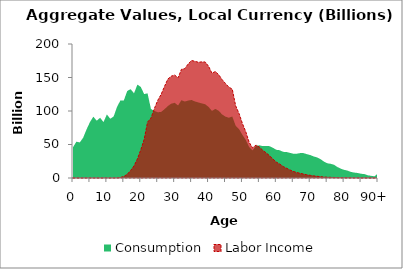
| Category | Consumption | Labor Income |
|---|---|---|
| 0 | 45936.427 | 0 |
|  | 54255.229 | 0 |
| 2 | 53065.486 | 0 |
| 3 | 60148.723 | 0 |
| 4 | 72591.052 | 0 |
| 5 | 83432.402 | 0 |
| 6 | 91546.477 | 0 |
| 7 | 85471.58 | 0 |
| 8 | 89942.673 | 0 |
| 9 | 83484.271 | 0 |
| 10 | 94815.383 | 0 |
| 11 | 88360.903 | 1.152 |
| 12 | 91930.239 | 29.5 |
| 13 | 106209.657 | 161.419 |
| 14 | 115863.689 | 769.564 |
| 15 | 115803.793 | 2270.729 |
| 16 | 129835.652 | 5556.189 |
| 17 | 132615.077 | 11134.875 |
| 18 | 126402.208 | 18033.81 |
| 19 | 139369.152 | 28402.507 |
| 20 | 135966.545 | 42038.818 |
| 21 | 125264.389 | 57671.408 |
| 22 | 126366.951 | 83533.535 |
| 23 | 103033.426 | 89332.149 |
| 24 | 100197.038 | 103474.667 |
| 25 | 98112.445 | 115806.153 |
| 26 | 98632.367 | 124751.923 |
| 27 | 102690.591 | 136626.567 |
| 28 | 107488.016 | 147753.256 |
| 29 | 110945.722 | 151971.844 |
| 30 | 112235.863 | 153651.645 |
| 31 | 108263.576 | 149386.562 |
| 32 | 116128.157 | 162242.102 |
| 33 | 114139.009 | 163270.689 |
| 34 | 115622.985 | 170351.139 |
| 35 | 116411.338 | 175366.67 |
| 36 | 114208.992 | 174133.738 |
| 37 | 112754.343 | 172736.05 |
| 38 | 111348.334 | 173333.066 |
| 39 | 110100.175 | 173167.027 |
| 40 | 106118.356 | 166840.7 |
| 41 | 100130.441 | 156491.25 |
| 42 | 103206.15 | 158836.529 |
| 43 | 100274.637 | 154161.395 |
| 44 | 94883.46 | 146822.785 |
| 45 | 91541.202 | 141027.278 |
| 46 | 89945.653 | 135642.72 |
| 47 | 91793.544 | 132567.847 |
| 48 | 78017.327 | 107760.883 |
| 49 | 72940.844 | 96128.982 |
| 50 | 64245.183 | 81237.045 |
| 51 | 56671.924 | 68864.759 |
| 52 | 45990.927 | 53035.5 |
| 53 | 41197.094 | 45039.383 |
| 54 | 48006.679 | 49152.828 |
| 55 | 48779.219 | 46155.237 |
| 56 | 47612.336 | 41312.215 |
| 57 | 47886.265 | 37484.775 |
| 58 | 47524.023 | 33277.982 |
| 59 | 45019.741 | 28212.525 |
| 60 | 42106.171 | 23723.24 |
| 61 | 41446.461 | 20794.595 |
| 62 | 39042.785 | 17153.968 |
| 63 | 38779.58 | 14660.033 |
| 64 | 37577.884 | 12059.552 |
| 65 | 36235.044 | 9807.384 |
| 66 | 36236.104 | 8216.235 |
| 67 | 37137.065 | 7005.501 |
| 68 | 37154.257 | 5907.608 |
| 69 | 35622.437 | 4755.318 |
| 70 | 34274.807 | 4007.014 |
| 71 | 32213.058 | 3202.921 |
| 72 | 30781.291 | 2604.137 |
| 73 | 28258.525 | 2003.577 |
| 74 | 24706.767 | 1487.89 |
| 75 | 22049.569 | 1168.6 |
| 76 | 21226.466 | 980.903 |
| 77 | 19807.81 | 786.1 |
| 78 | 16438.828 | 562.672 |
| 79 | 13957.693 | 411.254 |
| 80 | 12181.643 | 317.249 |
| 81 | 11054.06 | 259.035 |
| 82 | 9070.948 | 189.732 |
| 83 | 8129.287 | 150.468 |
| 84 | 7461.632 | 123.23 |
| 85 | 6351.659 | 93.568 |
| 86 | 5829.147 | 76.855 |
| 87 | 4036.771 | 46.981 |
| 88 | 3226.878 | 32.497 |
| 89 | 2540.286 | 21.523 |
| 90+ | 7075.938 | 48.553 |